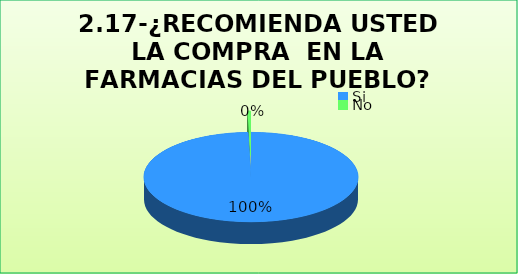
| Category | Series 0 |
|---|---|
| Si  | 0.995 |
| No | 0.005 |